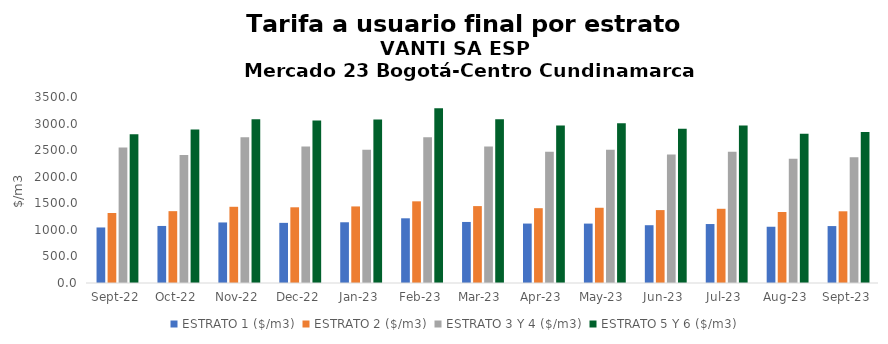
| Category | ESTRATO 1 ($/m3) | ESTRATO 2 ($/m3) | ESTRATO 3 Y 4 ($/m3) | ESTRATO 5 Y 6 ($/m3) |
|---|---|---|---|---|
| 2022-09-01 | 1044.96 | 1317 | 2548.14 | 2798.4 |
| 2022-10-01 | 1073.46 | 1351.82 | 2408.2 | 2889.84 |
| 2022-11-01 | 1139.35 | 1434.14 | 2741.78 | 3081.132 |
| 2022-12-01 | 1131.49 | 1424.62 | 2567.53 | 3057.768 |
| 2023-01-01 | 1142.83 | 1440.88 | 2506.69 | 3074.928 |
| 2023-02-01 | 1217.5 | 1536.84 | 2741.78 | 3290.136 |
| 2023-03-01 | 1148.64 | 1447.09 | 2567.53 | 3081.036 |
| 2023-04-01 | 1118.47 | 1407.56 | 2468.54 | 2962.248 |
| 2023-05-01 | 1117.85 | 1415.65 | 2506.69 | 3008.028 |
| 2023-06-01 | 1087.36 | 1371.98 | 2417.38 | 2900.856 |
| 2023-07-01 | 1109.69 | 1396.46 | 2468.54 | 2962.248 |
| 2023-08-01 | 1058.46 | 1336.01 | 2339.09 | 2806.908 |
| 2023-09-01 | 1071.3 | 1349.34 | 2366.44 | 2839.728 |